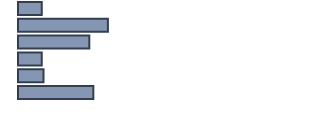
| Category | Series 0 |
|---|---|
| 0 | 7.7 |
| 1 | 29 |
| 2 | 23 |
| 3 | 7.7 |
| 4 | 8.2 |
| 5 | 24.3 |